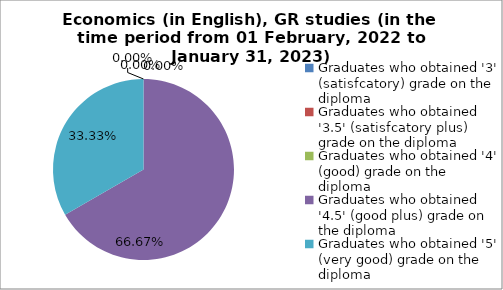
| Category | Series 0 |
|---|---|
| Graduates who obtained '3' (satisfcatory) grade on the diploma  | 0 |
| Graduates who obtained '3.5' (satisfcatory plus) grade on the diploma  | 0 |
| Graduates who obtained '4' (good) grade on the diploma  | 0 |
| Graduates who obtained '4.5' (good plus) grade on the diploma  | 66.667 |
| Graduates who obtained '5' (very good) grade on the diploma  | 33.333 |